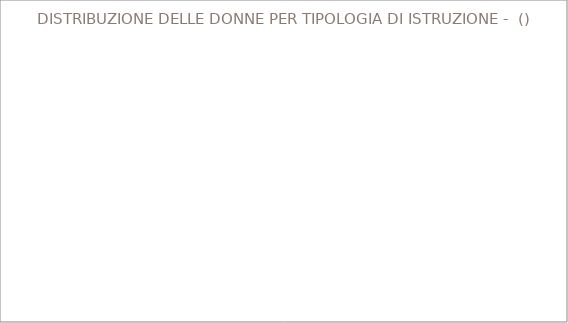
| Category | DISTRIBUZIONE DELLE DONNE PER TIPOLOGIA DI ISTRUZIONE -  () |
|---|---|
| licenza elementare - nessun titolo  | 0 |
| licenza media  | 0 |
| diploma di scuola secondaria superiore  | 0 |
| qualifica professionale  | 0 |
| dottorato - laurea - diploma universitario | 0 |